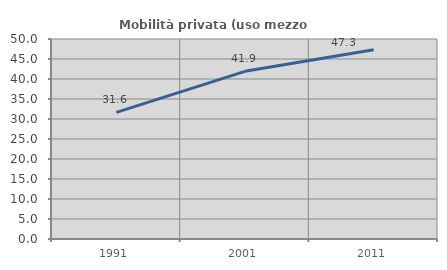
| Category | Mobilità privata (uso mezzo privato) |
|---|---|
| 1991.0 | 31.643 |
| 2001.0 | 41.917 |
| 2011.0 | 47.291 |